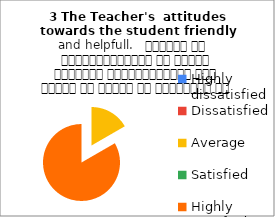
| Category | 3 The Teacher's  attitudes towards the student friendly and helpfull.   शिक्षक का विद्यार्थियों के प्रति व्यवहार मित्रतापूर्ण एवम सहयोग के भावना से परिपूर्ण था |
|---|---|
| Highly dissatisfied | 0 |
| Dissatisfied | 0 |
| Average | 1 |
| Satisfied | 0 |
| Highly satisfied | 5 |